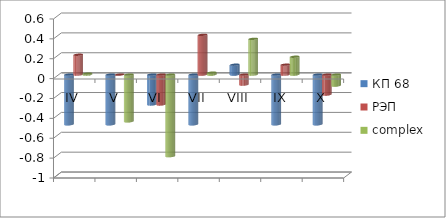
| Category | КП 68 | РЭП  | complex |
|---|---|---|---|
| IV | -0.5 | 0.2 | 0.01 |
| V | -0.5 | 0 | -0.47 |
| VI | -0.3 | -0.3 | -0.82 |
| VII | -0.5 | 0.4 | 0.02 |
| VIII | 0.1 | -0.1 | 0.36 |
| IX | -0.5 | 0.1 | 0.18 |
| X | -0.5 | -0.2 | -0.11 |